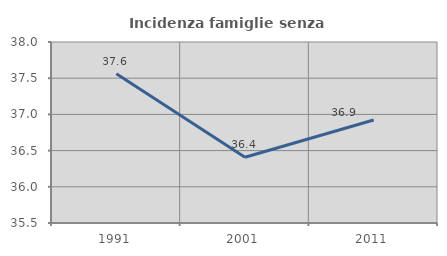
| Category | Incidenza famiglie senza nuclei |
|---|---|
| 1991.0 | 37.561 |
| 2001.0 | 36.408 |
| 2011.0 | 36.923 |